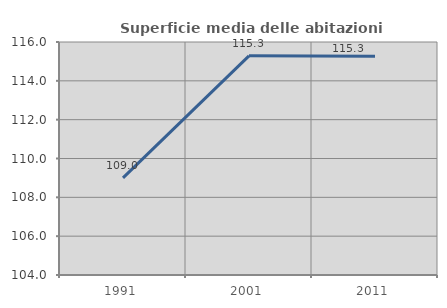
| Category | Superficie media delle abitazioni occupate |
|---|---|
| 1991.0 | 109 |
| 2001.0 | 115.286 |
| 2011.0 | 115.261 |